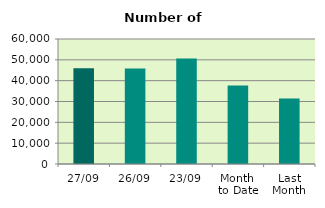
| Category | Series 0 |
|---|---|
| 27/09 | 45952 |
| 26/09 | 45864 |
| 23/09 | 50698 |
| Month 
to Date | 37639.158 |
| Last
Month | 31456 |